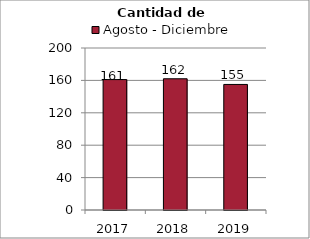
| Category | Agosto - Diciembre |
|---|---|
| 2017.0 | 161 |
| 2018.0 | 162 |
| 2019.0 | 155 |